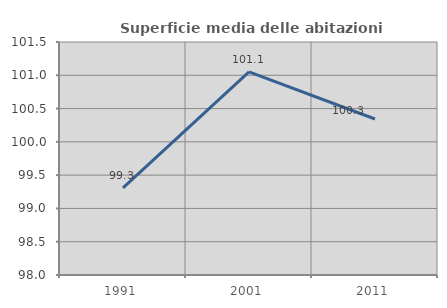
| Category | Superficie media delle abitazioni occupate |
|---|---|
| 1991.0 | 99.309 |
| 2001.0 | 101.052 |
| 2011.0 | 100.344 |